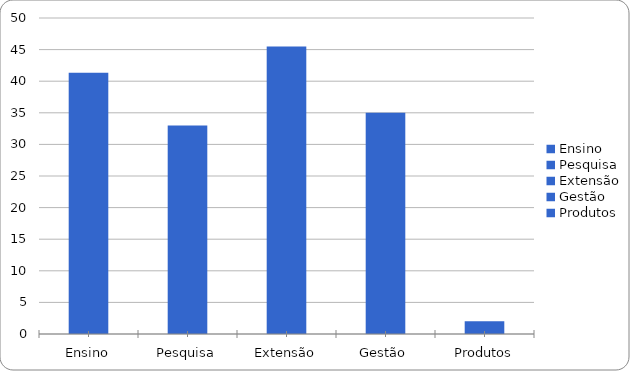
| Category | Series 0 |
|---|---|
| Ensino | 41.33 |
| Pesquisa | 33 |
| Extensão | 45.5 |
| Gestão | 35 |
| Produtos | 2 |